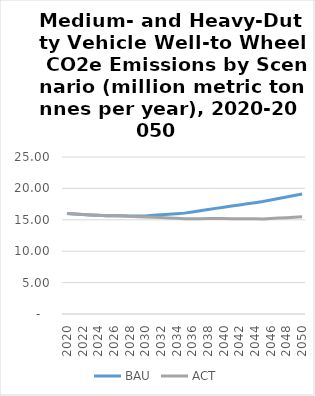
| Category | BAU | ACT |
|---|---|---|
| 2020.0 | 16.005 | 16.005 |
| 2021.0 | 15.93 | 15.93 |
| 2022.0 | 15.855 | 15.855 |
| 2023.0 | 15.781 | 15.781 |
| 2024.0 | 15.706 | 15.706 |
| 2025.0 | 15.631 | 15.631 |
| 2026.0 | 15.628 | 15.628 |
| 2027.0 | 15.626 | 15.587 |
| 2028.0 | 15.624 | 15.545 |
| 2029.0 | 15.621 | 15.504 |
| 2030.0 | 15.619 | 15.462 |
| 2031.0 | 15.708 | 15.407 |
| 2032.0 | 15.796 | 15.351 |
| 2033.0 | 15.885 | 15.295 |
| 2034.0 | 15.973 | 15.239 |
| 2035.0 | 16.062 | 15.183 |
| 2036.0 | 16.251 | 15.185 |
| 2037.0 | 16.441 | 15.186 |
| 2038.0 | 16.63 | 15.188 |
| 2039.0 | 16.819 | 15.189 |
| 2040.0 | 17.009 | 15.191 |
| 2041.0 | 17.187 | 15.182 |
| 2042.0 | 17.366 | 15.173 |
| 2043.0 | 17.545 | 15.163 |
| 2044.0 | 17.723 | 15.154 |
| 2045.0 | 17.902 | 15.145 |
| 2046.0 | 18.144 | 15.211 |
| 2047.0 | 18.386 | 15.276 |
| 2048.0 | 18.628 | 15.342 |
| 2049.0 | 18.87 | 15.408 |
| 2050.0 | 19.112 | 15.474 |